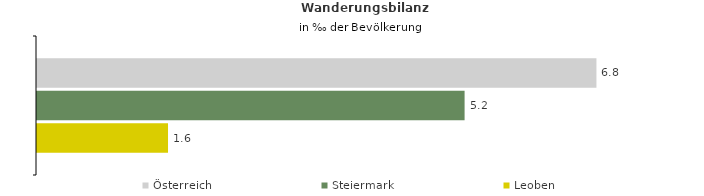
| Category | Österreich | Steiermark | Leoben |
|---|---|---|---|
| Wanderungsrate in ‰ der Bevölkerung, Periode 2015-2019 | 6.771 | 5.175 | 1.586 |